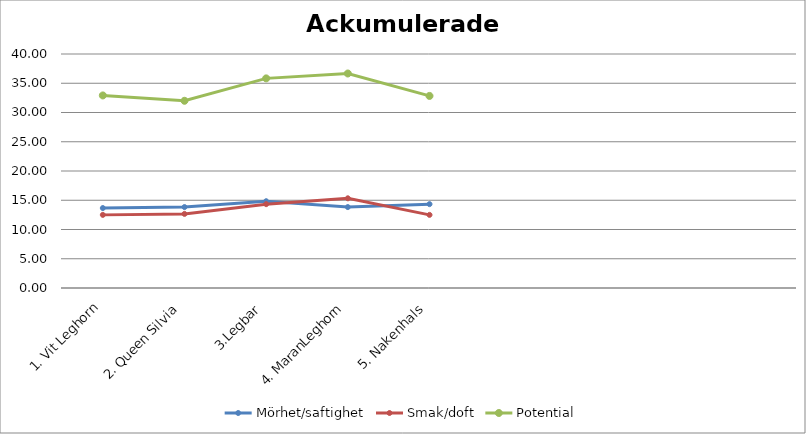
| Category | Mörhet/saftighet | Smak/doft | Potential |
|---|---|---|---|
| 1. Vit Leghorn | 13.667 | 12.5 | 32.917 |
| 2. Queen Silvia | 13.833 | 12.667 | 32 |
| 3.Legbar | 14.833 | 14.333 | 35.833 |
| 4. MaranLeghorn | 13.833 | 15.333 | 36.667 |
| 5. Nakenhals | 14.333 | 12.5 | 32.833 |